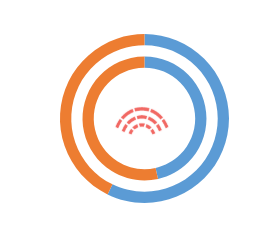
| Category | RS | Series 1 | EU |
|---|---|---|---|
| 0 | 46.5 |  | 57.2 |
| 1 | 53.5 |  | 42.8 |